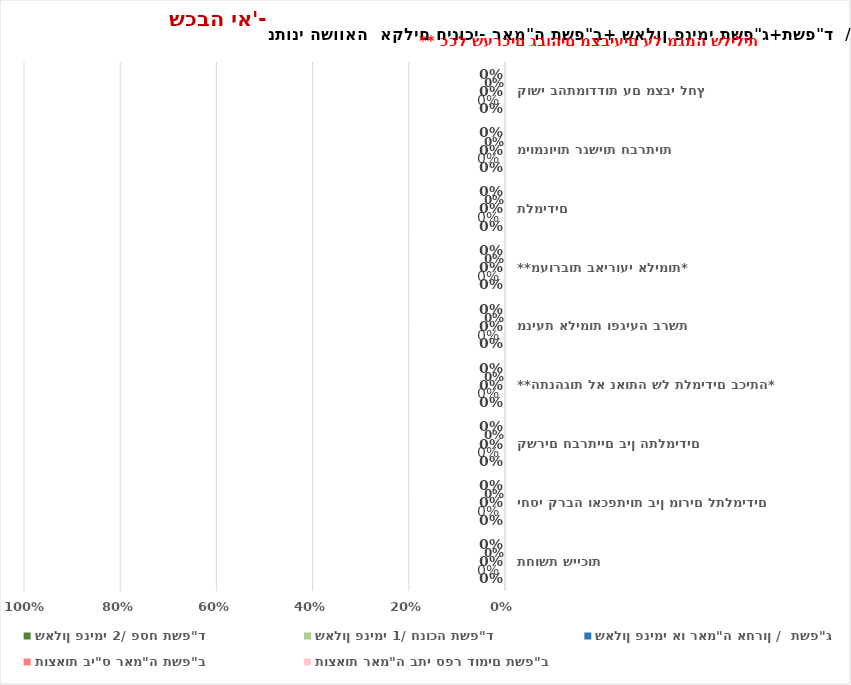
| Category | שאלון פנימי 2/ פסח תשפ"ד  | שאלון פנימי 1/ חנוכה תשפ"ד | שאלון פנימי או ראמ"ה אחרון /  תשפ"ג   | תוצאות בי"ס ראמ"ה תשפ"ב  | תוצאות ראמ"ה בתי ספר דומים תשפ"ב   |
|---|---|---|---|---|---|
| תחושת שייכות | 0 | 0 | 0 | 0 | 0 |
| יחסי קרבה ואכפתיות בין מורים לתלמידים | 0 | 0 | 0 | 0 | 0 |
| קשרים חברתיים בין התלמידים | 0 | 0 | 0 | 0 | 0 |
| **התנהגות לא נאותה של תלמידים בכיתה* | 0 | 0 | 0 | 0 | 0 |
| מניעת אלימות ופגיעה ברשת | 0 | 0 | 0 | 0 | 0 |
| **מעורבות באירועי אלימות* | 0 | 0 | 0 | 0 | 0 |
| מאמצי בית הספר לקידום מעורבות חברתית של תלמידים | 0 | 0 | 0 | 0 | 0 |
| מיומנויות רגשיות חברתיות | 0 | 0 | 0 | 0 | 0 |
| קושי בהתמודדות עם מצבי לחץ | 0 | 0 | 0 | 0 | 0 |